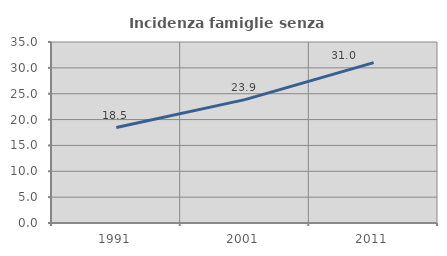
| Category | Incidenza famiglie senza nuclei |
|---|---|
| 1991.0 | 18.463 |
| 2001.0 | 23.854 |
| 2011.0 | 31.02 |